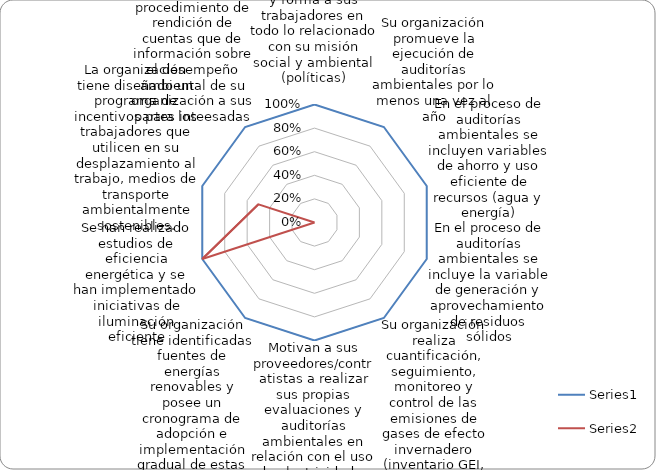
| Category | Series 0 | Series 1 |
|---|---|---|
| Su organización socializa, capacita y forma a sus trabajadores en todo lo relacionado con su misión social y ambiental (políticas) | 1 | 0 |
| Su organización promueve la ejecución de auditorías ambientales por lo menos una vez al año | 1 | 0 |
| En el proceso de auditorías ambientales se incluyen variables de ahorro y uso eficiente de recursos (agua y energía) | 1 | 0 |
| En el proceso de auditorías ambientales se incluye la variable de generación y aprovechamiento de residuos sólidos | 1 | 0 |
| Su organización realiza cuantificación, seguimiento, monitoreo y control de las emisiones de gases de efecto invernadero (inventario GEI, medición de la huella de carbono, programas de mititgación y adaptación al cambio climático, etc.) | 1 | 0 |
| Motivan a sus proveedores/contratistas a realizar sus propias evaluaciones y auditorías ambientales en relación con el uso de electricidad y agua, generación de desechos, emisiones de gases de efecto invernadero y empleo de energías renovables. | 1 | 0 |
| Su organización tiene identificadas fuentes de energías renovables y posee un cronograma de adopción e implementación gradual de estas en su operación  | 1 | 0 |
| Se han realizado estudios de eficiencia energética y se han implementado iniciativas de iluminación eficiente | 1 | 1 |
| La organización tiene diseñado un programa de incentivos para los trabajadores que utilicen en su desplazamiento al trabajo, medios de transporte ambientalmente sostenibles. | 1 | 0.5 |
| Existe un procedimiento de rendición de cuentas que de información sobre el desempeño ambiental de su organización a sus partes inteesadas | 1 | 0 |